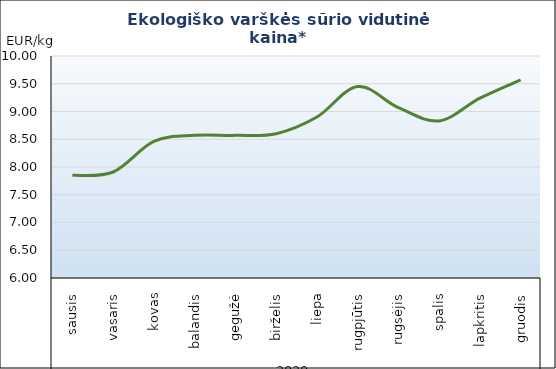
| Category | Varškės sūris |
|---|---|
| 0 | 7.85 |
| 1 | 7.91 |
| 2 | 8.46 |
| 3 | 8.57 |
| 4 | 8.57 |
| 5 | 8.6 |
| 6 | 8.9 |
| 7 | 9.45 |
| 8 | 9.07 |
| 9 | 8.83 |
| 10 | 9.24 |
| 11 | 9.57 |